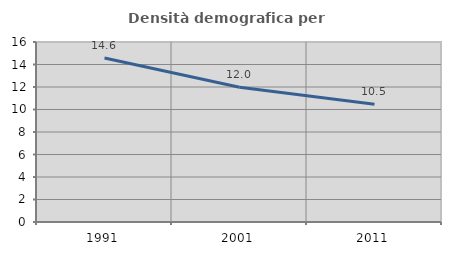
| Category | Densità demografica |
|---|---|
| 1991.0 | 14.582 |
| 2001.0 | 11.985 |
| 2011.0 | 10.464 |